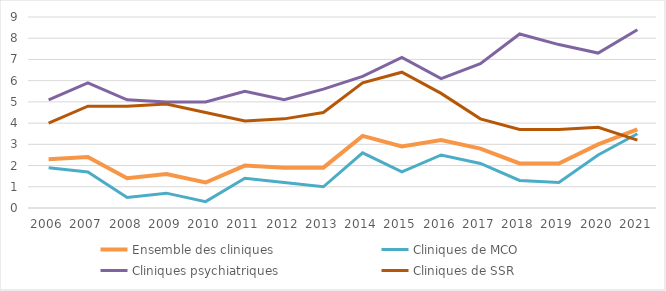
| Category | Ensemble des cliniques | Cliniques de MCO | Cliniques psychiatriques | Cliniques de SSR |
|---|---|---|---|---|
| 2006 | 2.3 | 1.9 | 5.1 | 4 |
| 2007 | 2.4 | 1.7 | 5.9 | 4.8 |
| 2008 | 1.4 | 0.5 | 5.1 | 4.8 |
| 2009 | 1.6 | 0.7 | 5 | 4.9 |
| 2010 | 1.2 | 0.3 | 5 | 4.5 |
| 2011 | 2 | 1.4 | 5.5 | 4.1 |
| 2012 | 1.9 | 1.2 | 5.1 | 4.2 |
| 2013 | 1.9 | 1 | 5.6 | 4.5 |
| 2014 | 3.4 | 2.6 | 6.2 | 5.9 |
| 2015 | 2.9 | 1.7 | 7.1 | 6.4 |
| 2016 | 3.2 | 2.5 | 6.1 | 5.4 |
| 2017 | 2.8 | 2.1 | 6.8 | 4.2 |
| 2018 | 2.1 | 1.3 | 8.2 | 3.7 |
| 2019 | 2.1 | 1.2 | 7.7 | 3.7 |
| 2020 | 3 | 2.5 | 7.3 | 3.8 |
| 2021 | 3.7 | 3.5 | 8.4 | 3.2 |